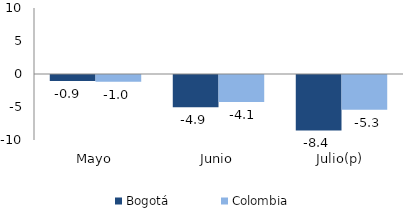
| Category | Bogotá | Colombia |
|---|---|---|
| Mayo | -0.892 | -1.01 |
| Junio | -4.883 | -4.087 |
| Julio(p) | -8.407 | -5.261 |